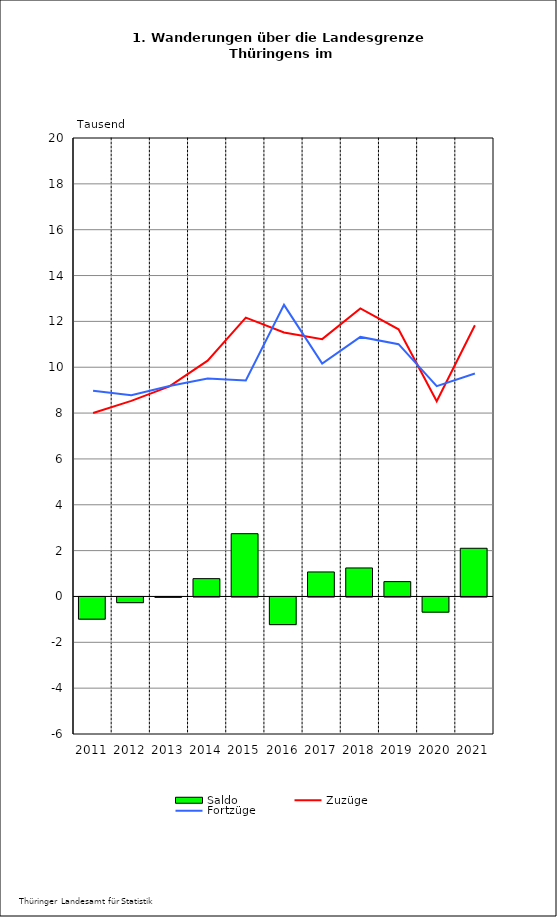
| Category | Saldo |
|---|---|
| 2011.0 | -0.968 |
| 2012.0 | -0.249 |
| 2013.0 | -0.016 |
| 2014.0 | 0.777 |
| 2015.0 | 2.738 |
| 2016.0 | -1.207 |
| 2017.0 | 1.069 |
| 2018.0 | 1.243 |
| 2019.0 | 0.647 |
| 2020.0 | -0.662 |
| 2021.0 | 2.102 |